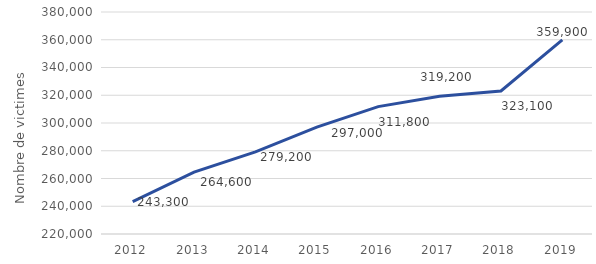
| Category | Series 0 |
|---|---|
| 2012.0 | 243300 |
| 2013.0 | 264600 |
| 2014.0 | 279200 |
| 2015.0 | 297000 |
| 2016.0 | 311800 |
| 2017.0 | 319200 |
| 2018.0 | 323100 |
| 2019.0 | 359900 |